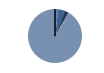
| Category | Series 0 |
|---|---|
| ARRASTRE | 14 |
| CERCO | 27 |
| PALANGRE | 20 |
| REDES DE ENMALLE | 0 |
| ARTES FIJAS | 1 |
| ARTES MENORES | 652 |
| SIN TIPO ASIGNADO | 0 |